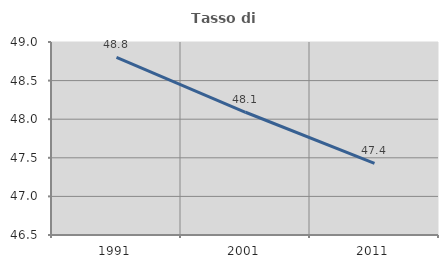
| Category | Tasso di occupazione   |
|---|---|
| 1991.0 | 48.802 |
| 2001.0 | 48.09 |
| 2011.0 | 47.427 |